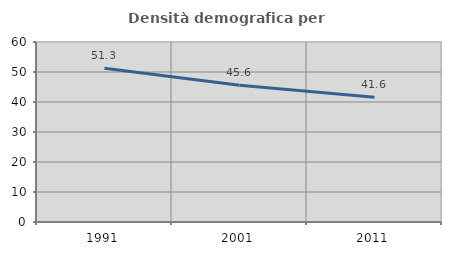
| Category | Densità demografica |
|---|---|
| 1991.0 | 51.269 |
| 2001.0 | 45.607 |
| 2011.0 | 41.595 |